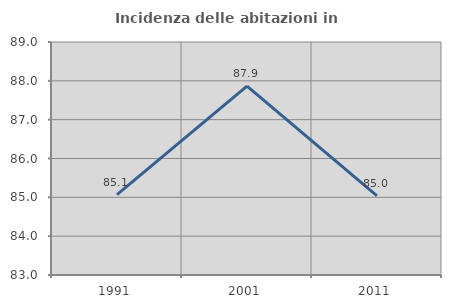
| Category | Incidenza delle abitazioni in proprietà  |
|---|---|
| 1991.0 | 85.069 |
| 2001.0 | 87.861 |
| 2011.0 | 85.037 |